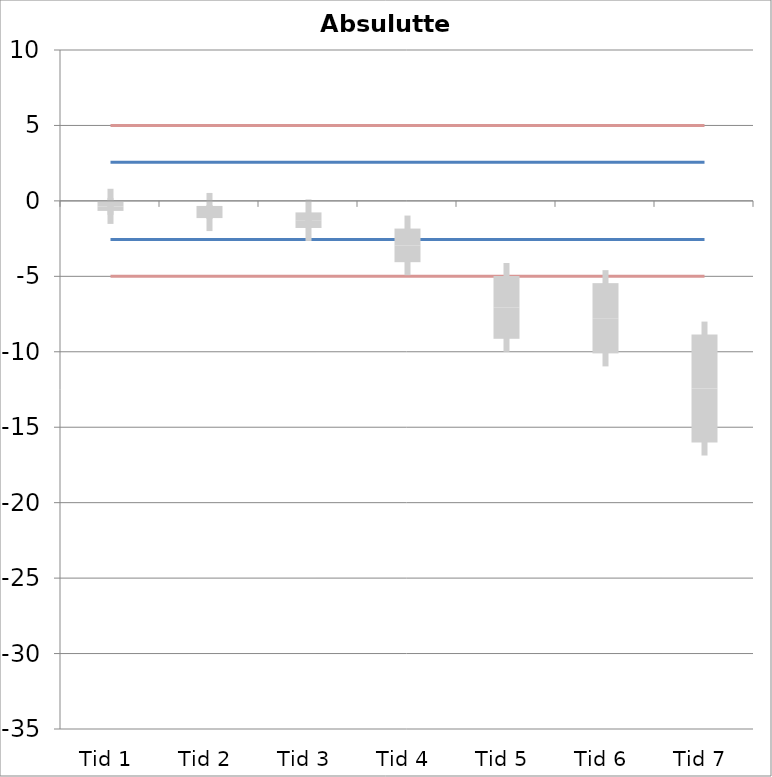
| Category | 1 | 2 | 3 | 4 | 5 | 6 | 7 | 8 | 9 | 10 | 11 | 12 | 13 | 14 | 15 | 16 | 17 | 18 | 19 | 20 | TEa | B | -B | -TEa | M |
|---|---|---|---|---|---|---|---|---|---|---|---|---|---|---|---|---|---|---|---|---|---|---|---|---|---|
| Tid 1 | 0.04 | -0.13 | -0.03 | -1.06 | 0.04 | -0.06 | -0.02 | -0.07 | 0.16 | 0.09 | 0.4 | -0.4 | -2.4 | 0 | -0.7 | -0.8 | -1 | 0.1 | -1 | -0.4 | 4.99 | 2.559 | -2.559 | -4.99 | -0.362 |
| Tid 2 | -0.11 | -0.01 | -0.03 | -0.47 | 0.05 | -0.84 | -0.12 | -0.13 | -1.29 | 0.01 | 0 | -1 | -2.8 | -0.5 | -2 | -2.5 | -0.8 | -0.1 | -1.2 | -0.9 | 4.99 | 2.559 | -2.559 | -4.99 | -0.737 |
| Tid 3 | -0.35 | 0 | -0.09 | -0.69 | -0.11 | -2.1 | -0.16 | -0.11 | -1.18 | -0.09 | -1.7 | -0.9 | -3 | -2 | -3 | -3 | -2.9 | -1 | -1.8 | -1.4 | 4.99 | 2.559 | -2.559 | -4.99 | -1.279 |
| Tid 4 | -1.26 | -1.03 | -1.02 | -1.92 | -1.1 | -5.13 | -0.08 | -0.49 | -8.47 | -0.96 | -1.5 | -1.3 | -3.8 | -2.1 | -3.7 | -3.4 | -3.7 | -5.4 | -5 | -7.6 | 4.99 | 2.559 | -2.559 | -4.99 | -2.948 |
| Tid 5 | -0.43 | -3.11 | -1.68 | -7.94 | -1.87 | -13.48 | -2.52 | -3.88 | -15.42 | -2.1 | -4.631 | -6.287 | -7.265 | -7.056 | -9.696 | -8.532 | -10.489 | -10.502 | -11.254 | -13.032 | 4.99 | 2.559 | -2.559 | -4.99 | -7.059 |
| Tid 6 | -1.91 | -4.25 | -3.09 | -6.1 | -2.96 | -15.95 | -3.12 | -1.21 | -17.35 | -2.869 | -4.935 | -5.491 | -6.815 | -9.593 | -9.44 | -10.103 | -10.527 | -12.231 | -12.89 | -14.751 | 4.99 | 2.559 | -2.559 | -4.99 | -7.779 |
| Tid 7 | -6.59 | -5.18 | -3.58 | -10.46 | -3.05 | -20.1 | -3.62 | -7.56 | -29.73 | -3.004 | -8.623 | -10.087 | -11.734 | -12.817 | -14.953 | -16.702 | -17.631 | -19.35 | -21.064 | -22.907 | 4.99 | 2.559 | -2.559 | -4.99 | -12.437 |